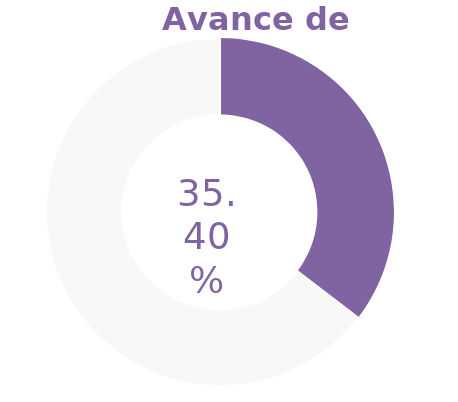
| Category | Series 0 |
|---|---|
| Acumulado 1 Trimestre | 0.354 |
| Año | -0.646 |